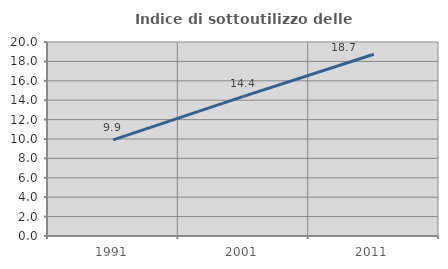
| Category | Indice di sottoutilizzo delle abitazioni  |
|---|---|
| 1991.0 | 9.914 |
| 2001.0 | 14.401 |
| 2011.0 | 18.737 |